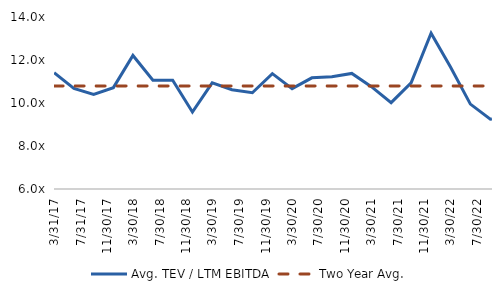
| Category |  Avg. TEV / LTM EBITDA  |  Two Year Avg.  |
|---|---|---|
| 3/31/17 | 11.406 | 10.793 |
| 6/30/17 | 10.681 | 10.793 |
| 9/29/17 | 10.399 | 10.793 |
| 12/29/17 | 10.715 | 10.793 |
| 3/29/18 | 12.212 | 10.793 |
| 6/29/18 | 11.062 | 10.793 |
| 9/28/18 | 11.055 | 10.793 |
| 12/28/18 | 9.582 | 10.793 |
| 3/29/19 | 10.94 | 10.793 |
| 6/28/19 | 10.618 | 10.793 |
| 9/30/19 | 10.478 | 10.793 |
| 12/31/19 | 11.366 | 10.793 |
| 3/31/20 | 10.669 | 10.793 |
| 6/30/20 | 11.17 | 10.793 |
| 9/30/20 | 11.222 | 10.793 |
| 12/31/20 | 11.375 | 10.793 |
| 3/31/21 | 10.76 | 10.793 |
| 6/30/21 | 10.015 | 10.793 |
| 9/30/21 | 10.937 | 10.793 |
| 12/31/21 | 13.248 | 10.793 |
| 3/31/22 | 11.665 | 10.793 |
| 6/30/22 | 9.949 | 10.793 |
| 9/30/22 | 9.248 | 10.793 |
| 10/7/22 | 9.257 | 10.793 |